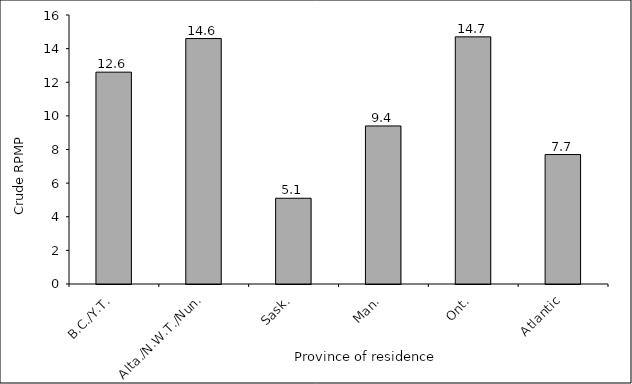
| Category | Crude RPMP |
|---|---|
| B.C./Y.T. | 12.6 |
| Alta./N.W.T./Nun. | 14.6 |
| Sask. | 5.1 |
| Man. | 9.4 |
| Ont. | 14.7 |
| Atlantic | 7.7 |